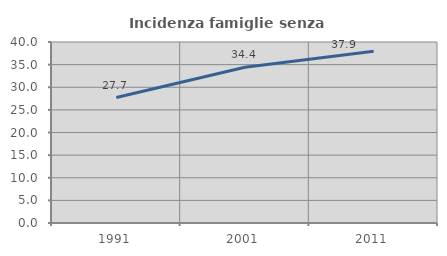
| Category | Incidenza famiglie senza nuclei |
|---|---|
| 1991.0 | 27.719 |
| 2001.0 | 34.417 |
| 2011.0 | 37.945 |